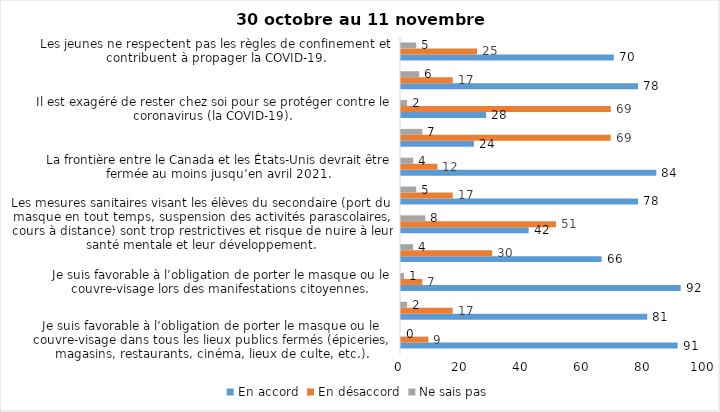
| Category | En accord | En désaccord | Ne sais pas |
|---|---|---|---|
| Je suis favorable à l’obligation de porter le masque ou le couvre-visage dans tous les lieux publics fermés (épiceries, magasins, restaurants, cinéma, lieux de culte, etc.). | 91 | 9 | 0 |
| C’est une bonne chose que les policiers puissent donner facilement des contraventions aux gens qui ne respectent pas les mesures pour prévenir le coronavirus (la COVID-19). | 81 | 17 | 2 |
| Je suis favorable à l’obligation de porter le masque ou le couvre-visage lors des manifestations citoyennes. | 92 | 7 | 1 |
| C’est une bonne chose d’arrêter les activités sportives de groupe (ex. hockey, soccer, yoga, etc.) et de fermer les centres d’entraînement (gyms) dans les zones rouges. | 66 | 30 | 4 |
| Les mesures sanitaires visant les élèves du secondaire (port du masque en tout temps, suspension des activités parascolaires, cours à distance) sont trop restrictives et risque de nuire à leur santé mentale et leur développement. | 42 | 51 | 8 |
| Je suis favorable à l’obligation de porter le masque ou le couvre-visage en tout temps pour les élèves au secondaire. | 78 | 17 | 5 |
| La frontière entre le Canada et les États-Unis devrait être fermée au moins jusqu’en avril 2021. | 84 | 12 | 4 |
| Le gouvernement et les médias exagèrent par rapport au coronavirus (la COVID-19). | 24 | 69 | 7 |
| Il est exagéré de rester chez soi pour se protéger contre le coronavirus (la COVID-19). | 28 | 69 | 2 |
| J’ai peur que le système de santé soit débordé par les cas de COVID-19 suite au «déconfinement». | 78 | 17 | 6 |
| Les jeunes ne respectent pas les règles de confinement et contribuent à propager la COVID-19. | 70 | 25 | 5 |